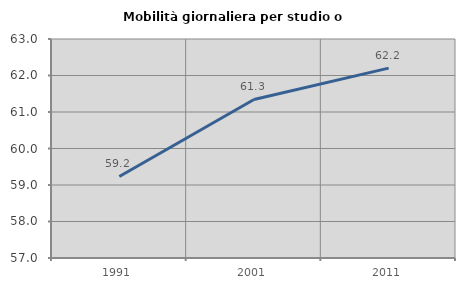
| Category | Mobilità giornaliera per studio o lavoro |
|---|---|
| 1991.0 | 59.234 |
| 2001.0 | 61.344 |
| 2011.0 | 62.202 |